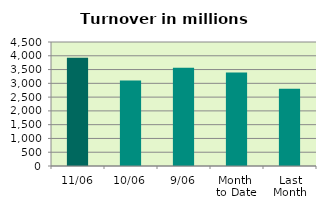
| Category | Series 0 |
|---|---|
| 11/06 | 3926.654 |
| 10/06 | 3102.156 |
| 9/06 | 3568.986 |
| Month 
to Date | 3390.374 |
| Last
Month | 2802.964 |